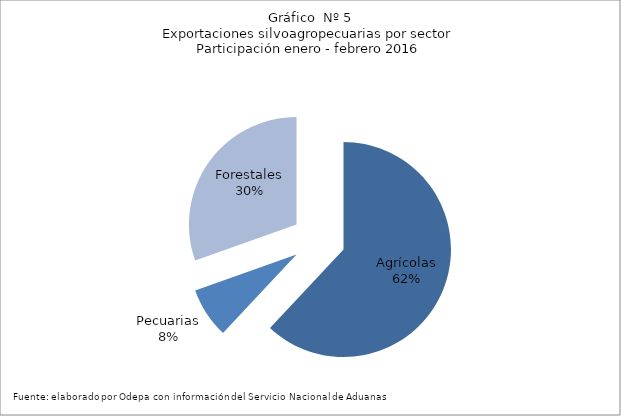
| Category | Series 0 |
|---|---|
| Agrícolas | 1571684 |
| Pecuarias | 192480 |
| Forestales | 771616 |